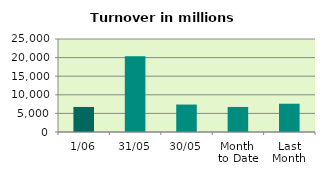
| Category | Series 0 |
|---|---|
| 1/06 | 6731.637 |
| 31/05 | 20377.8 |
| 30/05 | 7381.147 |
| Month 
to Date | 6731.637 |
| Last
Month | 7604.877 |